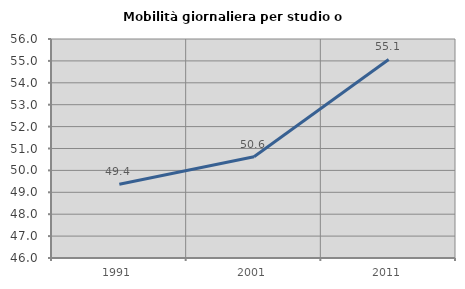
| Category | Mobilità giornaliera per studio o lavoro |
|---|---|
| 1991.0 | 49.367 |
| 2001.0 | 50.623 |
| 2011.0 | 55.067 |